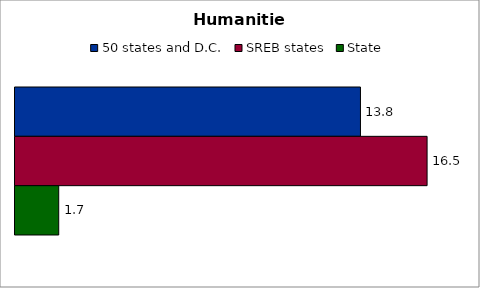
| Category | 50 states and D.C. | SREB states | State |
|---|---|---|---|
| Humanities | 13.819 | 16.484 | 1.749 |